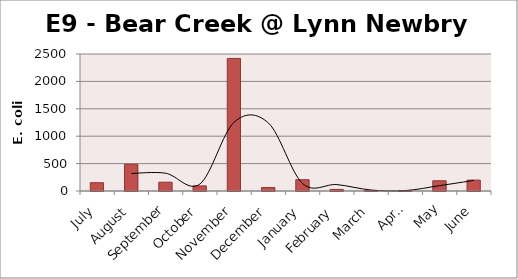
| Category | E. coli MPN |
|---|---|
| July | 151.5 |
| August | 488.4 |
| September | 160.7 |
| October | 93.3 |
| November | 2419.2 |
| December | 64.4 |
| January | 206.3 |
| February | 28.5 |
| March | 6.3 |
| April | 8.6 |
| May | 187.2 |
| June | 198.9 |